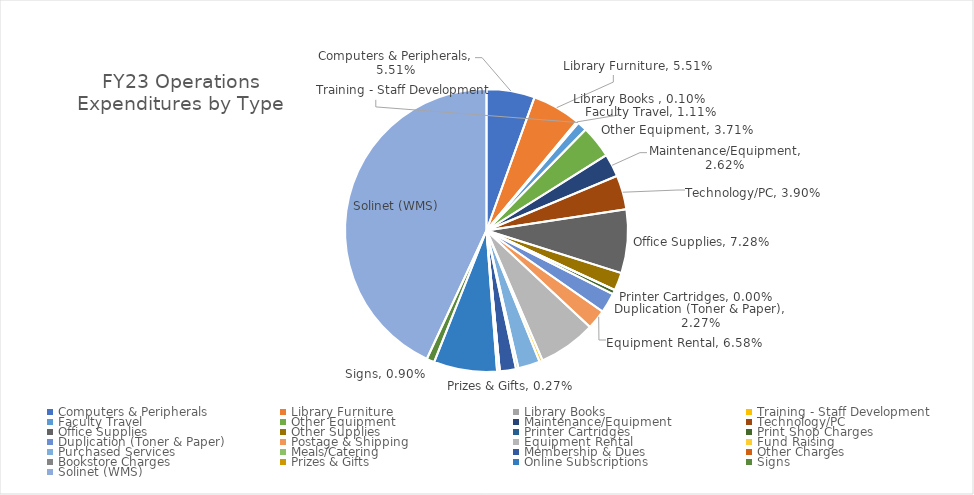
| Category | Series 0 |
|---|---|
| Computers & Peripherals | 0.055 |
| Library Furniture | 0.055 |
| Library Books  | 0.001 |
| Training - Staff Development | 0.001 |
| Faculty Travel | 0.011 |
| Other Equipment | 0.037 |
| Maintenance/Equipment | 0.026 |
| Technology/PC | 0.039 |
| Office Supplies | 0.073 |
| Other Supplies | 0.02 |
| Printer Cartridges | 0 |
| Print Shop Charges | 0.005 |
| Duplication (Toner & Paper) | 0.023 |
| Postage & Shipping | 0.022 |
| Equipment Rental | 0.066 |
| Fund Raising | 0.004 |
| Purchased Services | 0.025 |
| Meals/Catering | 0.003 |
| Membership & Dues | 0.018 |
| Other Charges | 0 |
| Bookstore Charges | 0 |
| Prizes & Gifts | 0.003 |
| Online Subscriptions | 0.072 |
| Signs | 0.009 |
| Solinet (WMS) | 0.431 |